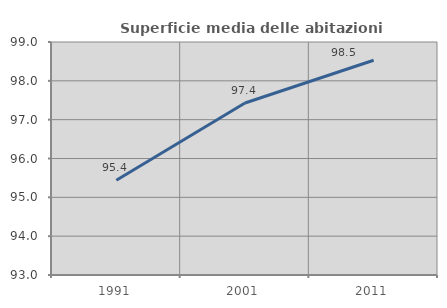
| Category | Superficie media delle abitazioni occupate |
|---|---|
| 1991.0 | 95.439 |
| 2001.0 | 97.43 |
| 2011.0 | 98.531 |